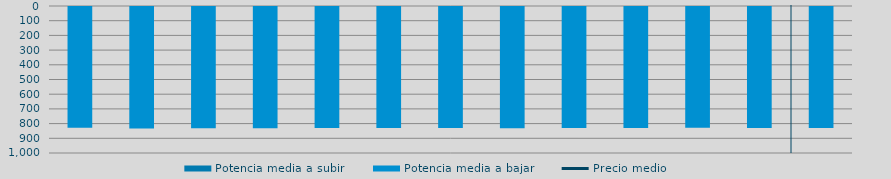
| Category | Potencia media a subir | Potencia media a bajar |
|---|---|---|
| 0 |  | 821.408 |
| 1 |  | 825.952 |
| 2 |  | 824.183 |
| 3 |  | 824.381 |
| 4 |  | 823.337 |
| 5 |  | 823.521 |
| 6 |  | 823.928 |
| 7 |  | 824.328 |
| 8 |  | 822.96 |
| 9 |  | 823.749 |
| 10 |  | 822.119 |
| 11 |  | 822.552 |
| 12 |  | 823.641 |